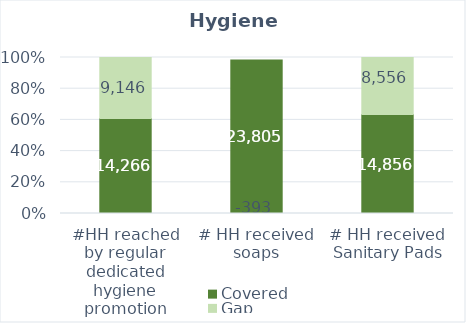
| Category | Covered | Gap |
|---|---|---|
| #HH reached by regular dedicated hygiene promotion | 14266 | 9146 |
| # HH received soaps | 23805 | -393 |
| # HH received Sanitary Pads | 14856 | 8556 |